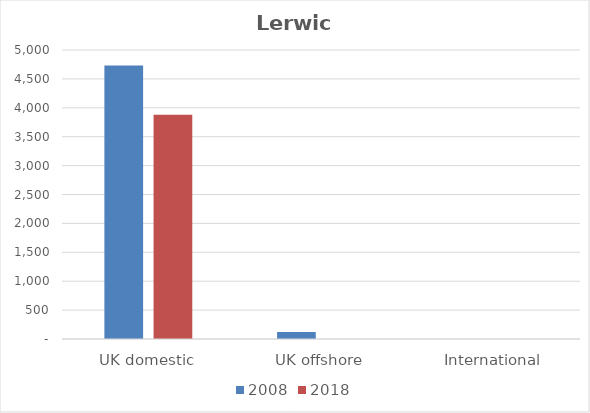
| Category | 2008 | 2018 |
|---|---|---|
| UK domestic | 4731 | 3881 |
| UK offshore | 123 | 0 |
| International | 0 | 0 |